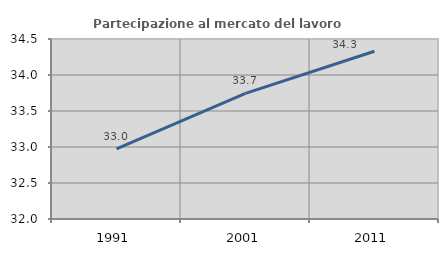
| Category | Partecipazione al mercato del lavoro  femminile |
|---|---|
| 1991.0 | 32.975 |
| 2001.0 | 33.744 |
| 2011.0 | 34.329 |